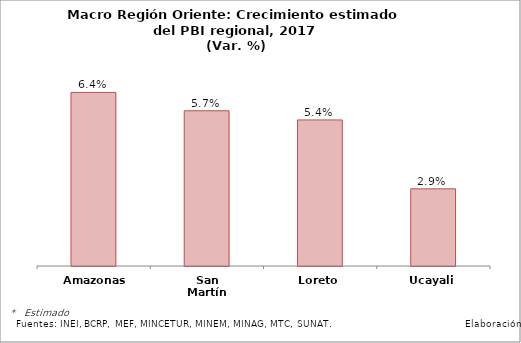
| Category | Series 0 |
|---|---|
| Amazonas | 0.064 |
| San Martín | 0.057 |
| Loreto | 0.054 |
| Ucayali | 0.029 |